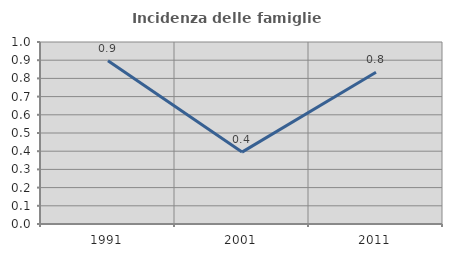
| Category | Incidenza delle famiglie numerose |
|---|---|
| 1991.0 | 0.896 |
| 2001.0 | 0.395 |
| 2011.0 | 0.834 |